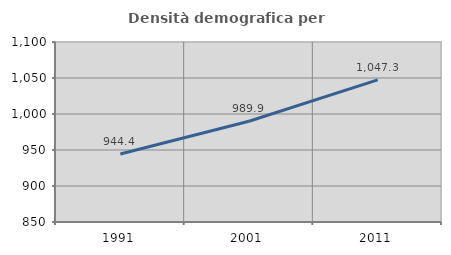
| Category | Densità demografica |
|---|---|
| 1991.0 | 944.379 |
| 2001.0 | 989.923 |
| 2011.0 | 1047.328 |